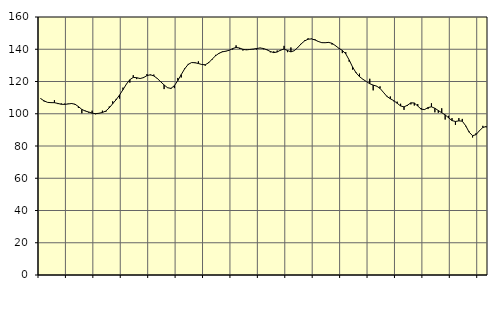
| Category | Piggar | Series 1 |
|---|---|---|
| nan | 109.6 | 109.36 |
| 87.0 | 107.6 | 107.99 |
| 87.0 | 107 | 107.05 |
| 87.0 | 107 | 106.88 |
| nan | 108.4 | 106.86 |
| 88.0 | 106 | 106.39 |
| 88.0 | 106.4 | 105.88 |
| 88.0 | 106.3 | 105.81 |
| nan | 106.3 | 106.06 |
| 89.0 | 106.6 | 106.34 |
| 89.0 | 105.6 | 105.93 |
| 89.0 | 103.6 | 104.45 |
| nan | 100.3 | 102.7 |
| 90.0 | 101.9 | 101.67 |
| 90.0 | 100.7 | 101.09 |
| 90.0 | 101.9 | 100.37 |
| nan | 99.7 | 100.04 |
| 91.0 | 100.2 | 100.3 |
| 91.0 | 101.9 | 100.79 |
| 91.0 | 101.2 | 101.69 |
| nan | 104.5 | 103.66 |
| 92.0 | 107.7 | 106.22 |
| 92.0 | 109.2 | 108.7 |
| 92.0 | 109.4 | 111.6 |
| nan | 116.2 | 114.93 |
| 93.0 | 118.5 | 118.37 |
| 93.0 | 119.3 | 121.13 |
| 93.0 | 123.9 | 122.52 |
| nan | 121.5 | 122.36 |
| 94.0 | 121.9 | 121.84 |
| 94.0 | 122.8 | 122.42 |
| 94.0 | 124.6 | 123.65 |
| nan | 123.9 | 124.18 |
| 95.0 | 124.3 | 123.46 |
| 95.0 | 122.1 | 121.9 |
| 95.0 | 120.1 | 119.84 |
| nan | 115.3 | 117.86 |
| 96.0 | 116.3 | 116.16 |
| 96.0 | 115.4 | 115.72 |
| 96.0 | 115.9 | 117.42 |
| nan | 122.2 | 120.57 |
| 97.0 | 122.5 | 124.3 |
| 97.0 | 128.2 | 127.85 |
| 97.0 | 130.9 | 130.55 |
| nan | 131.7 | 131.74 |
| 98.0 | 131.4 | 131.66 |
| 98.0 | 132.5 | 131.15 |
| 98.0 | 130.6 | 130.54 |
| nan | 129.8 | 130.38 |
| 99.0 | 132.1 | 131.62 |
| 99.0 | 133.5 | 133.83 |
| 99.0 | 136.5 | 135.92 |
| nan | 137.2 | 137.48 |
| 0.0 | 138.7 | 138.39 |
| 0.0 | 138.6 | 138.81 |
| 0.0 | 139.5 | 139.37 |
| nan | 139.8 | 140.42 |
| 1.0 | 142.4 | 141.12 |
| 1.0 | 140.2 | 140.77 |
| 1.0 | 139.2 | 139.95 |
| nan | 140 | 139.63 |
| 2.0 | 139.8 | 139.86 |
| 2.0 | 139.9 | 140.11 |
| 2.0 | 139.8 | 140.46 |
| nan | 140.9 | 140.78 |
| 3.0 | 140 | 140.46 |
| 3.0 | 140 | 139.64 |
| 3.0 | 138.1 | 138.61 |
| nan | 138.7 | 137.9 |
| 4.0 | 139.2 | 138.3 |
| 4.0 | 139.2 | 139.49 |
| 4.0 | 142.1 | 140.1 |
| nan | 138.2 | 139.23 |
| 5.0 | 141.1 | 138.39 |
| 5.0 | 139.3 | 139.11 |
| 5.0 | 141.3 | 141.09 |
| nan | 143.2 | 143.38 |
| 6.0 | 145.5 | 145.17 |
| 6.0 | 146.8 | 146.24 |
| 6.0 | 146.6 | 146.41 |
| nan | 146.3 | 145.78 |
| 7.0 | 144.6 | 144.82 |
| 7.0 | 143.9 | 144.08 |
| 7.0 | 144.2 | 144.05 |
| nan | 144 | 144.25 |
| 8.0 | 142.9 | 143.69 |
| 8.0 | 142 | 142.22 |
| 8.0 | 140.4 | 140.6 |
| nan | 137.6 | 139.29 |
| 9.0 | 138.2 | 137.16 |
| 9.0 | 132.3 | 133.35 |
| 9.0 | 127.4 | 128.92 |
| nan | 125.8 | 125.42 |
| 10.0 | 124.9 | 123.02 |
| 10.0 | 121.3 | 121.39 |
| 10.0 | 120 | 120 |
| nan | 121.7 | 118.62 |
| 11.0 | 114.5 | 117.77 |
| 11.0 | 117 | 117.14 |
| 11.0 | 117 | 115.72 |
| nan | 113.4 | 113.26 |
| 12.0 | 111.1 | 110.76 |
| 12.0 | 110.7 | 109.3 |
| 12.0 | 107.7 | 108.14 |
| nan | 107.5 | 106.5 |
| 13.0 | 106.2 | 104.83 |
| 13.0 | 102.4 | 104.26 |
| 13.0 | 104.8 | 105.29 |
| nan | 105.8 | 106.78 |
| 14.0 | 105.1 | 106.68 |
| 14.0 | 106 | 104.79 |
| 14.0 | 103.6 | 102.82 |
| nan | 102.4 | 102.6 |
| 15.0 | 102.9 | 103.85 |
| 15.0 | 106.5 | 104.3 |
| 15.0 | 100.9 | 103.4 |
| nan | 100.6 | 102 |
| 16.0 | 103.4 | 100.63 |
| 16.0 | 96.4 | 99.32 |
| 16.0 | 98.7 | 97.48 |
| nan | 97.3 | 95.76 |
| 17.0 | 93.1 | 95.21 |
| 17.0 | 97.3 | 95.6 |
| 17.0 | 96.8 | 95.39 |
| nan | 92.2 | 92.54 |
| 18.0 | 89 | 88.56 |
| 18.0 | 85.3 | 86.39 |
| 18.0 | 87.9 | 87.04 |
| nan | 89.7 | 89.48 |
| 19.0 | 92.5 | 91.48 |
| 19.0 | 91.6 | 92.11 |